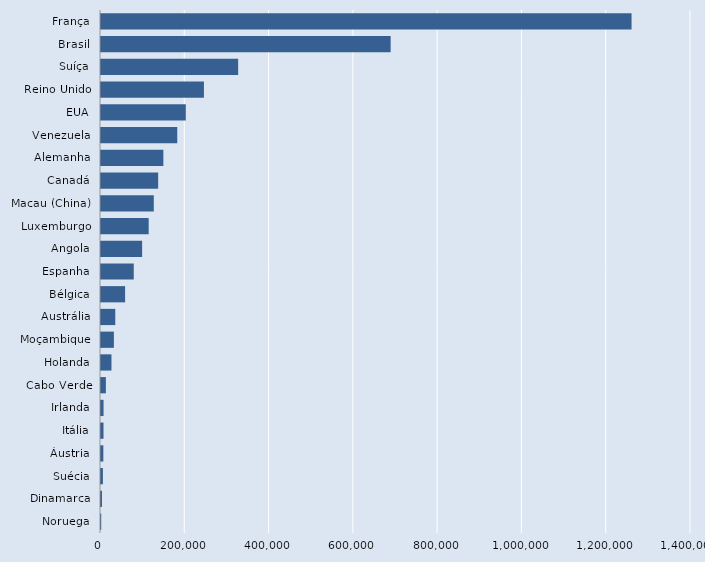
| Category | Series 0 |
|---|---|
| Noruega | 538 |
| Dinamarca | 2363 |
| Suécia | 4523 |
| Áustria | 5568 |
| Itália | 5945 |
| Irlanda | 6047 |
| Cabo Verde | 11562 |
| Holanda | 24847 |
| Moçambique | 30582 |
| Austrália | 33892 |
| Bélgica | 57215 |
| Espanha | 77710 |
| Angola | 97576 |
| Luxemburgo | 113145 |
| Macau (China) | 125296 |
| Canadá | 135678 |
| Alemanha | 147992 |
| Venezuela | 180959 |
| EUA | 201227 |
| Reino Unido | 244252 |
| Suíça | 325459 |
| Brasil | 687322 |
| França | 1258953 |